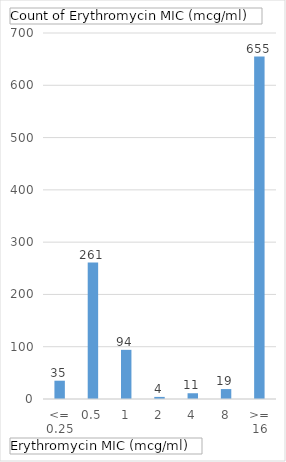
| Category | Total |
|---|---|
| <= 0.25 | 35 |
| 0.5 | 261 |
| 1 | 94 |
| 2 | 4 |
| 4 | 11 |
| 8 | 19 |
| >= 16 | 655 |